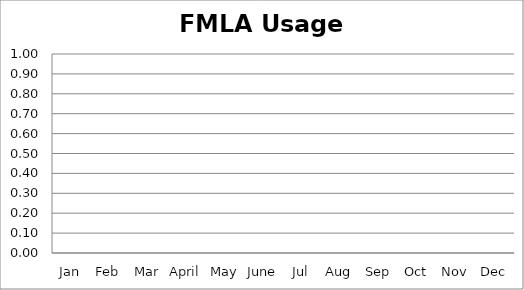
| Category | Series 0 |
|---|---|
| Jan | 0 |
| Feb | 0 |
| Mar | 0 |
| April | 0 |
| May | 0 |
| June | 0 |
| Jul | 0 |
| Aug | 0 |
| Sep | 0 |
| Oct | 0 |
| Nov | 0 |
| Dec | 0 |